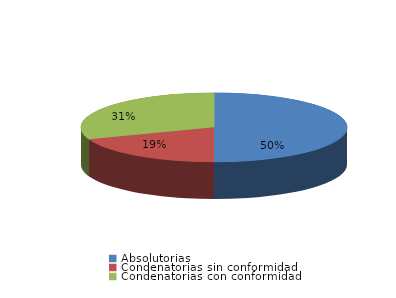
| Category | Series 0 |
|---|---|
| Absolutorias | 173 |
| Condenatorias sin conformidad | 67 |
| Condenatorias con conformidad | 106 |